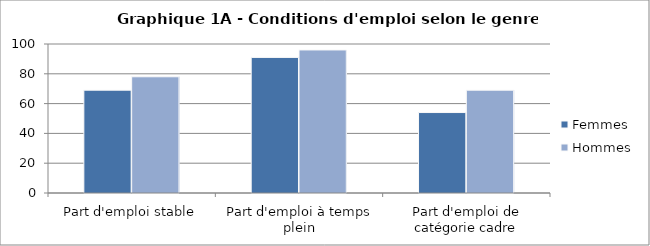
| Category | Femmes | Hommes |
|---|---|---|
| Part d'emploi stable | 69 | 78 |
| Part d'emploi à temps plein | 91 | 96 |
| Part d'emploi de catégorie cadre | 54 | 69 |